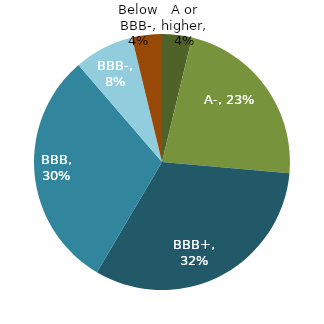
| Category | Series 0 |
|---|---|
| A or higher | 0.038 |
| A- | 0.226 |
| BBB+ | 0.321 |
| BBB | 0.302 |
| BBB- | 0.075 |
| Below BBB- | 0.038 |